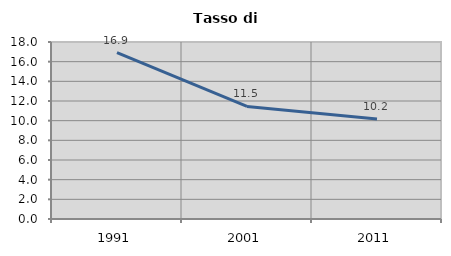
| Category | Tasso di disoccupazione   |
|---|---|
| 1991.0 | 16.92 |
| 2001.0 | 11.45 |
| 2011.0 | 10.178 |